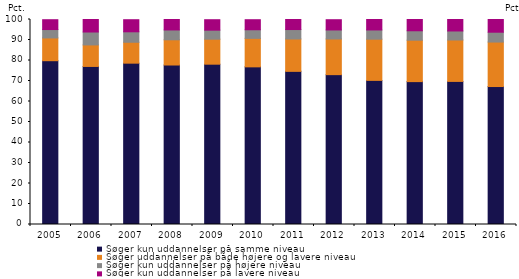
| Category | Søger kun uddannelser på samme niveau | Søger uddannelser på både højere og lavere niveau | Søger kun uddannelser på højere niveau | Søger kun uddannelser på lavere niveau |
|---|---|---|---|---|
| 2005.0 | 79.9 | 11.1 | 4.1 | 4.8 |
| 2006.0 | 77.1 | 10.5 | 6.3 | 6.1 |
| 2007.0 | 78.7 | 10.2 | 5.1 | 5.9 |
| 2008.0 | 77.8 | 12.3 | 4.8 | 5.2 |
| 2009.0 | 78.2 | 12.2 | 4.4 | 5.1 |
| 2010.0 | 76.9 | 13.9 | 4.2 | 4.9 |
| 2011.0 | 74.7 | 15.8 | 4.6 | 4.9 |
| 2012.0 | 73.1 | 17.4 | 4.4 | 5 |
| 2013.0 | 70.3 | 20.1 | 4.5 | 5.1 |
| 2014.0 | 69.7 | 20.2 | 4.6 | 5.5 |
| 2015.0 | 69.8 | 20.2 | 4.4 | 5.6 |
| 2016.0 | 67.3 | 21.7 | 4.8 | 6.2 |